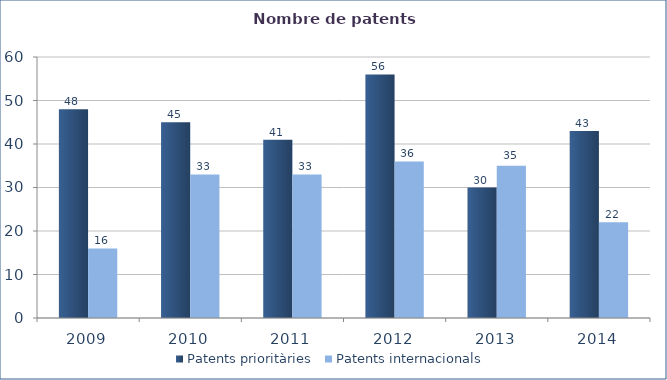
| Category | Patents prioritàries | Patents internacionals |
|---|---|---|
| 2009.0 | 48 | 16 |
| 2010.0 | 45 | 33 |
| 2011.0 | 41 | 33 |
| 2012.0 | 56 | 36 |
| 2013.0 | 30 | 35 |
| 2014.0 | 43 | 22 |